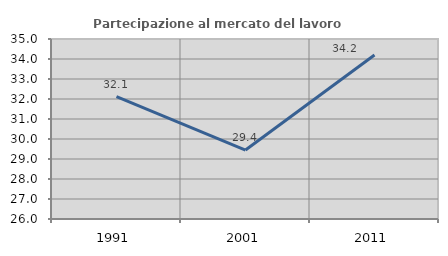
| Category | Partecipazione al mercato del lavoro  femminile |
|---|---|
| 1991.0 | 32.117 |
| 2001.0 | 29.446 |
| 2011.0 | 34.199 |